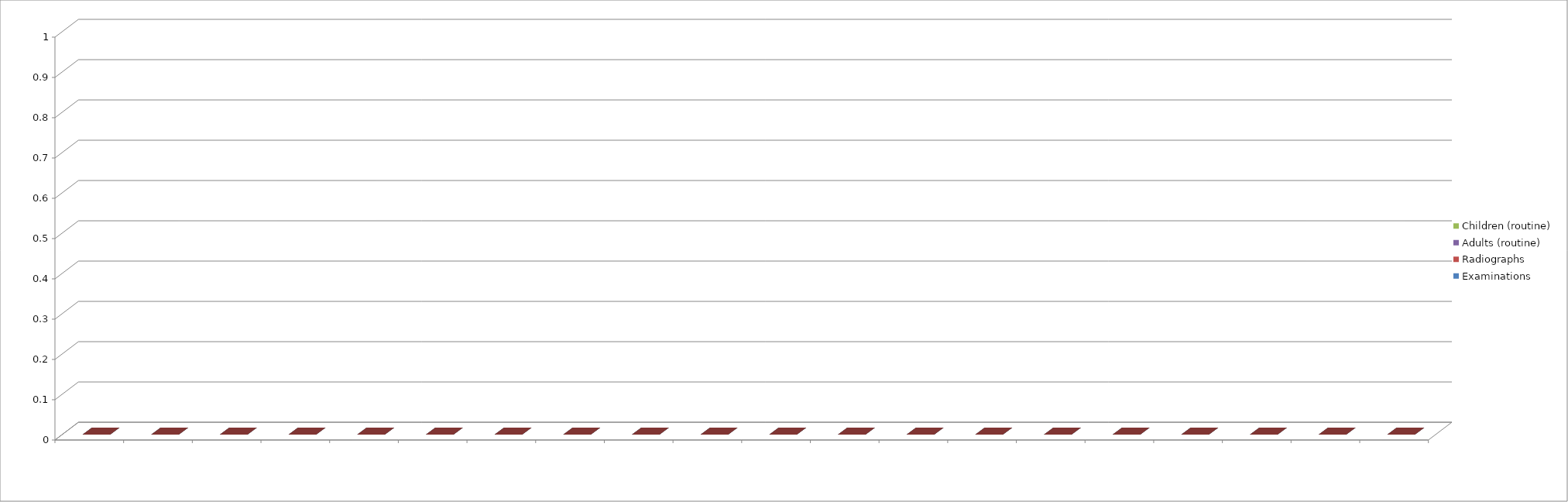
| Category | Examinations | Radiographs | Adults (routine) | Children (routine) |
|---|---|---|---|---|
| 0 | 0 | 0 | 0 | 0 |
| 1 | 0 | 0 | 0 | 0 |
| 2 | 0 | 0 | 0 | 0 |
| 3 | 0 | 0 | 0 | 0 |
| 4 | 0 | 0 | 0 | 0 |
| 5 | 0 | 0 | 0 | 0 |
| 6 | 0 | 0 | 0 | 0 |
| 7 | 0 | 0 | 0 | 0 |
| 8 | 0 | 0 | 0 | 0 |
| 9 | 0 | 0 | 0 | 0 |
| 10 | 0 | 0 | 0 | 0 |
| 11 | 0 | 0 | 0 | 0 |
| 12 | 0 | 0 | 0 | 0 |
| 13 | 0 | 0 | 0 | 0 |
| 14 | 0 | 0 | 0 | 0 |
| 15 | 0 | 0 | 0 | 0 |
| 16 | 0 | 0 | 0 | 0 |
| 17 | 0 | 0 | 0 | 0 |
| 18 | 0 | 0 | 0 | 0 |
| 19 | 0 | 0 | 0 | 0 |